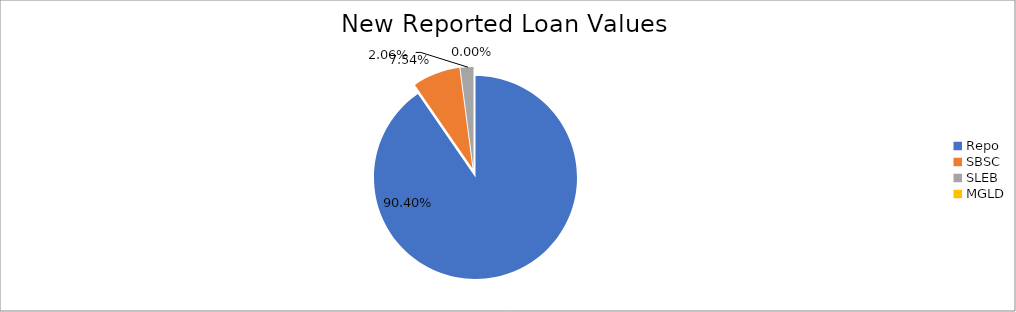
| Category | Series 0 |
|---|---|
| Repo | 12241098.381 |
| SBSC | 1020366.488 |
| SLEB | 278977.865 |
| MGLD | 409.6 |